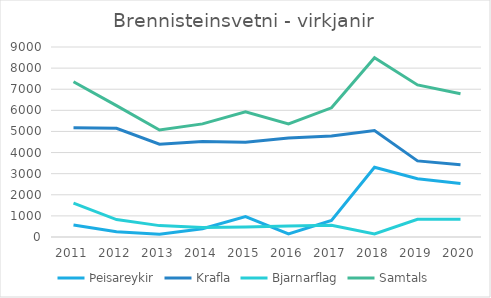
| Category | Þeisareykir | Krafla | Bjarnarflag | Samtals |
|---|---|---|---|---|
| 2011 | 570 | 5180 | 1603 | 7353 |
| 2012 | 246 | 5151 | 826 | 6223 |
| 2013 | 136 | 4392 | 539 | 5067 |
| 2014 | 391 | 4520 | 447 | 5358 |
| 2015 | 971 | 4483 | 477 | 5931 |
| 2016 | 150 | 4689 | 521 | 5360 |
| 2017 | 787 | 4780 | 551 | 6118 |
| 2018 | 3304 | 5044 | 146 | 8494 |
| 2019 | 2758 | 3604 | 840 | 7202 |
| 2020 | 2530 | 3423 | 836 | 6789 |